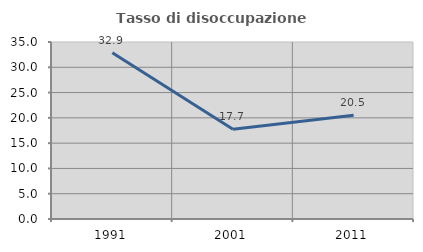
| Category | Tasso di disoccupazione giovanile  |
|---|---|
| 1991.0 | 32.87 |
| 2001.0 | 17.742 |
| 2011.0 | 20.536 |